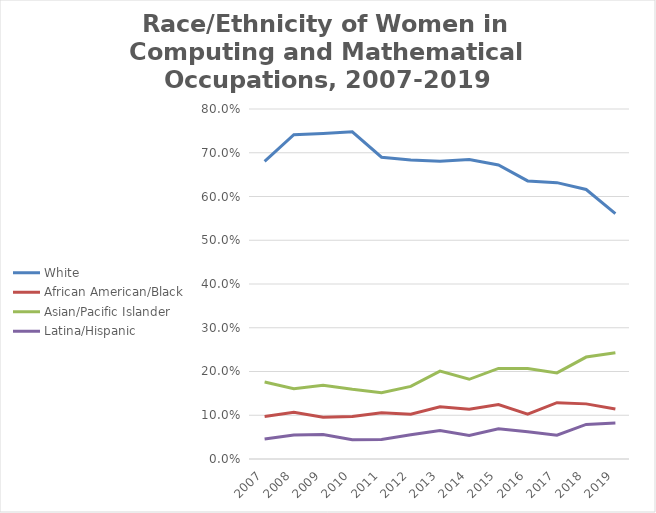
| Category | White | African American/Black | Asian/Pacific Islander | Latina/Hispanic |
|---|---|---|---|---|
| 2007 | 0.68 | 0.097 | 0.176 | 0.046 |
| 2008 | 0.741 | 0.107 | 0.161 | 0.055 |
| 2009 | 0.744 | 0.095 | 0.168 | 0.056 |
| 2010 | 0.748 | 0.097 | 0.159 | 0.044 |
| 2011 | 0.69 | 0.106 | 0.152 | 0.045 |
| 2012 | 0.684 | 0.102 | 0.166 | 0.055 |
| 2013 | 0.68 | 0.12 | 0.201 | 0.065 |
| 2014 | 0.685 | 0.114 | 0.182 | 0.054 |
| 2015 | 0.672 | 0.125 | 0.207 | 0.069 |
| 2016 | 0.636 | 0.103 | 0.207 | 0.062 |
| 2017 | 0.632 | 0.129 | 0.197 | 0.054 |
| 2018 | 0.616 | 0.126 | 0.233 | 0.079 |
| 2019 | 0.561 | 0.114 | 0.243 | 0.082 |